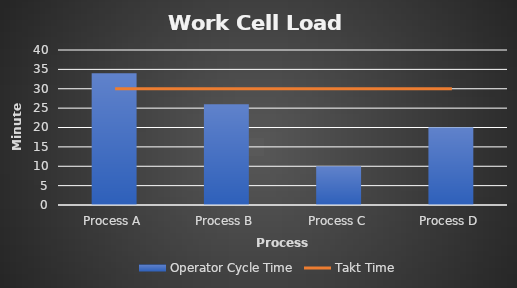
| Category | Operator Cycle Time |
|---|---|
| Process A | 34 |
| Process B | 26 |
| Process C | 10 |
| Process D | 20 |